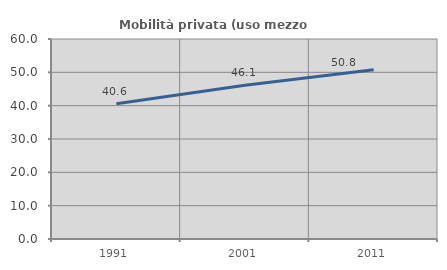
| Category | Mobilità privata (uso mezzo privato) |
|---|---|
| 1991.0 | 40.57 |
| 2001.0 | 46.121 |
| 2011.0 | 50.798 |